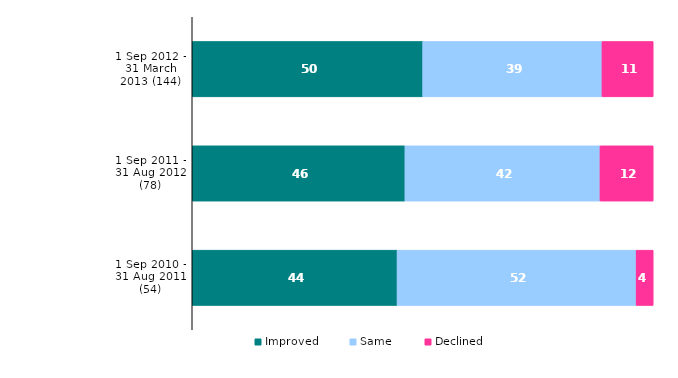
| Category | Improved | Same | Declined |
|---|---|---|---|
| 1 Sep 2012 - 31 March 2013 (144) | 50 | 38.889 | 11.111 |
| 1 Sep 2011 - 31 Aug 2012 (78) | 46.154 | 42.308 | 11.538 |
| 1 Sep 2010 - 31 Aug 2011 (54) | 44.444 | 51.852 | 3.704 |